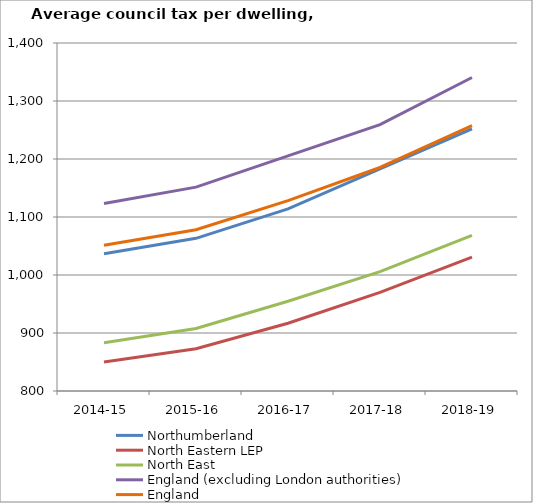
| Category | Northumberland | North Eastern LEP | North East | England (excluding London authorities) | England |
|---|---|---|---|---|---|
| 2014-15 | 1036.51 | 849.863 | 883.059 | 1123.397 | 1051.35 |
| 2015-16 | 1063.19 | 872.959 | 907.908 | 1151.443 | 1078.01 |
| 2016-17 | 1113.94 | 916.824 | 954.691 | 1205.284 | 1128.1 |
| 2017-18 | 1183.13 | 970.097 | 1005.849 | 1259.199 | 1185.37 |
| 2018-19 | 1251.75 | 1030.711 | 1068.233 | 1340.558 | 1257.63 |